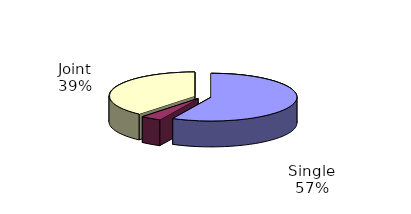
| Category | Series 0 |
|---|---|
| Single | 2206564 |
| Separate | 149297 |
| Joint | 1489792 |